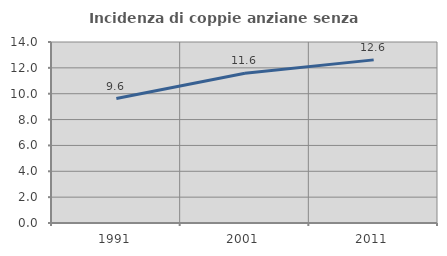
| Category | Incidenza di coppie anziane senza figli  |
|---|---|
| 1991.0 | 9.625 |
| 2001.0 | 11.579 |
| 2011.0 | 12.617 |